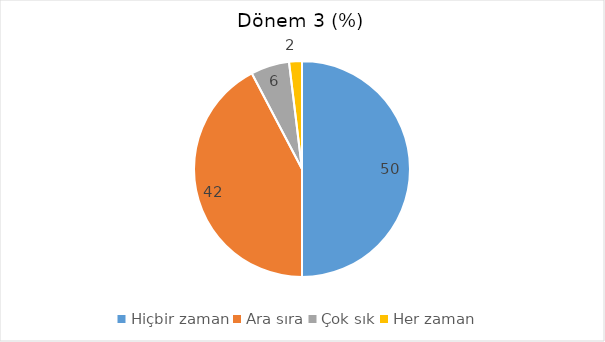
| Category | Dönem 3  (%) |
|---|---|
| Hiçbir zaman | 50 |
| Ara sıra | 42.308 |
| Çok sık | 5.769 |
| Her zaman | 1.923 |